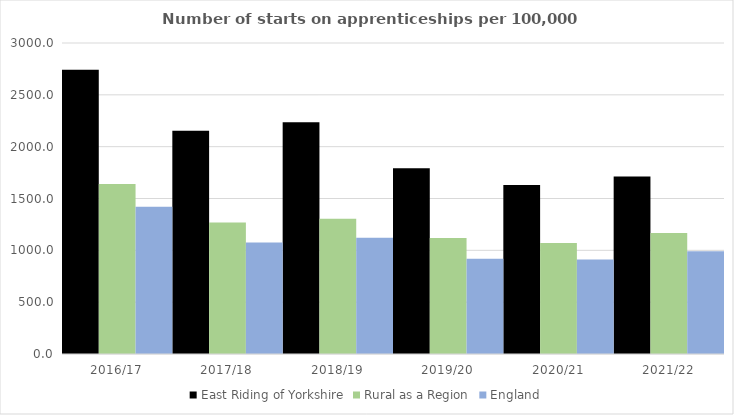
| Category | East Riding of Yorkshire | Rural as a Region | England |
|---|---|---|---|
| 2016/17 | 2742 | 1638.789 | 1420 |
| 2017/18 | 2153 | 1267.474 | 1075 |
| 2018/19 | 2235 | 1304.57 | 1122 |
| 2019/20 | 1792 | 1119.662 | 918 |
| 2020/21 | 1630 | 1070.748 | 912 |
| 2021/22 | 1713 | 1167.68 | 991 |